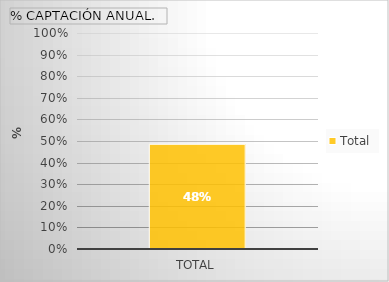
| Category | Total |
|---|---|
| Total | 0.485 |